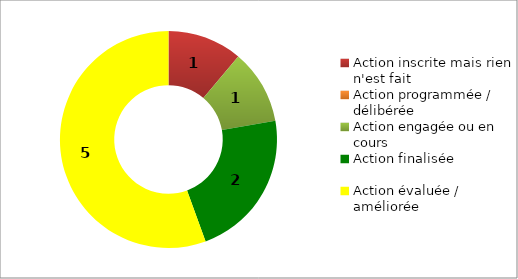
| Category | Series 0 |
|---|---|
| Action inscrite mais rien n'est fait | 1 |
| Action programmée / délibérée | 0 |
| Action engagée ou en cours | 1 |
| Action finalisée | 2 |
| Action évaluée / améliorée | 5 |